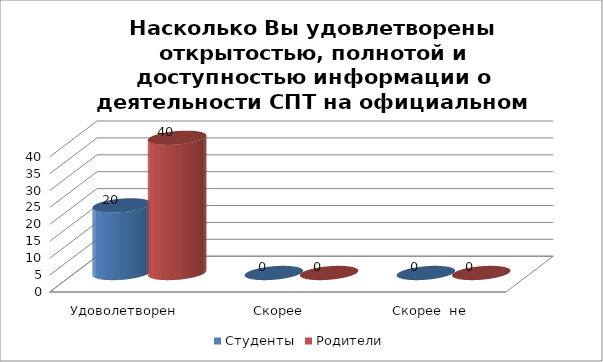
| Category | Студенты | Родители |
|---|---|---|
| Удоволетворен | 20 | 40 |
| Скорее удовлетворен | 0 | 0 |
| Скорее  не удовлетворен | 0 | 0 |